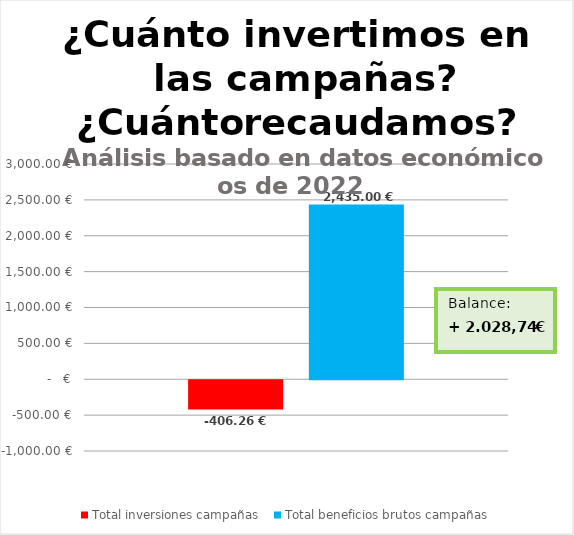
| Category | Total inversiones campañas  | Total beneficios brutos campañas |
|---|---|---|
| 0 | -406.26 | 2435 |